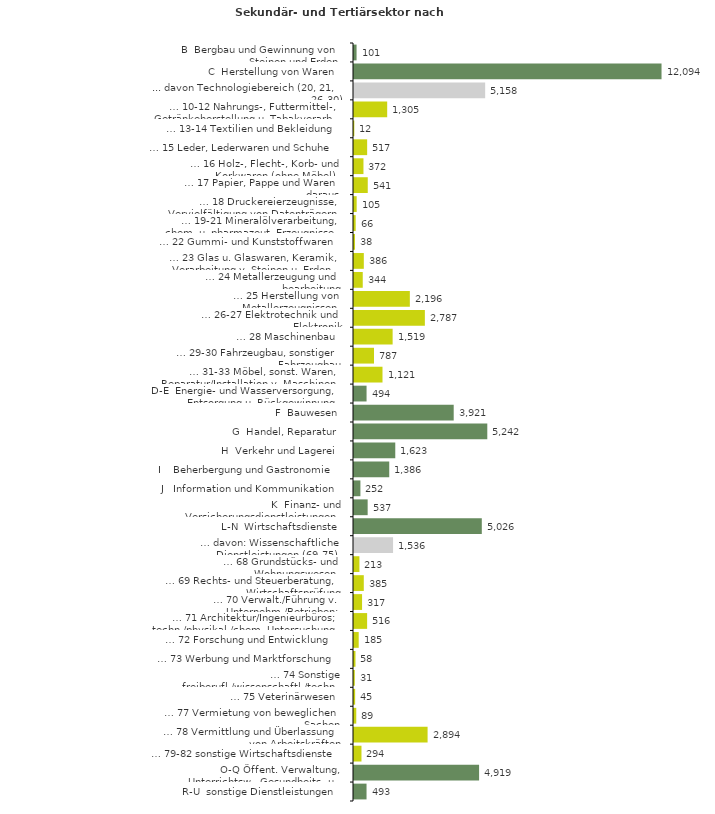
| Category | Series 0 |
|---|---|
| B  Bergbau und Gewinnung von Steinen und Erden | 101 |
| C  Herstellung von Waren | 12094 |
| ... davon Technologiebereich (20, 21, 26-30) | 5158 |
| … 10-12 Nahrungs-, Futtermittel-, Getränkeherstellung u. Tabakverarb. | 1305 |
| … 13-14 Textilien und Bekleidung | 12 |
| … 15 Leder, Lederwaren und Schuhe | 517 |
| … 16 Holz-, Flecht-, Korb- und Korkwaren (ohne Möbel)  | 372 |
| … 17 Papier, Pappe und Waren daraus  | 541 |
| … 18 Druckereierzeugnisse, Vervielfältigung von Datenträgern | 105 |
| … 19-21 Mineralölverarbeitung, chem. u. pharmazeut. Erzeugnisse | 66 |
| … 22 Gummi- und Kunststoffwaren | 38 |
| … 23 Glas u. Glaswaren, Keramik, Verarbeitung v. Steinen u. Erden  | 386 |
| … 24 Metallerzeugung und -bearbeitung | 344 |
| … 25 Herstellung von Metallerzeugnissen  | 2196 |
| … 26-27 Elektrotechnik und Elektronik | 2787 |
| … 28 Maschinenbau | 1519 |
| … 29-30 Fahrzeugbau, sonstiger Fahrzeugbau | 787 |
| … 31-33 Möbel, sonst. Waren, Reparatur/Installation v. Maschinen | 1121 |
| D-E  Energie- und Wasserversorgung, Entsorgung u. Rückgewinnung | 494 |
| F  Bauwesen | 3921 |
| G  Handel, Reparatur | 5242 |
| H  Verkehr und Lagerei | 1623 |
| I    Beherbergung und Gastronomie | 1386 |
| J   Information und Kommunikation | 252 |
| K  Finanz- und Versicherungsdienstleistungen | 537 |
| L-N  Wirtschaftsdienste | 5026 |
| … davon: Wissenschaftliche Dienstleistungen (69-75) | 1536 |
| … 68 Grundstücks- und Wohnungswesen  | 213 |
| … 69 Rechts- und Steuerberatung, Wirtschaftsprüfung | 385 |
| … 70 Verwalt./Führung v. Unternehm./Betrieben; Unternehmensberat. | 317 |
| … 71 Architektur/Ingenieurbüros; techn./physikal./chem. Untersuchung | 516 |
| … 72 Forschung und Entwicklung  | 185 |
| … 73 Werbung und Marktforschung | 58 |
| … 74 Sonstige freiberufl./wissenschaftl./techn. Tätigkeiten | 31 |
| … 75 Veterinärwesen | 45 |
| … 77 Vermietung von beweglichen Sachen  | 89 |
| … 78 Vermittlung und Überlassung von Arbeitskräften | 2894 |
| … 79-82 sonstige Wirtschaftsdienste | 294 |
| O-Q Öffent. Verwaltung, Unterrichtsw., Gesundheits- u. Sozialwesen | 4919 |
| R-U  sonstige Dienstleistungen | 493 |